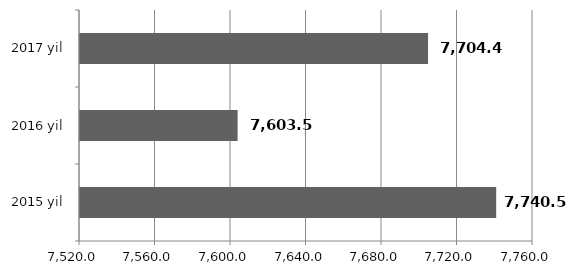
| Category | Series 0 |
|---|---|
| 2015 yil | 7740.5 |
| 2016 yil | 7603.5 |
| 2017 yil | 7704.4 |